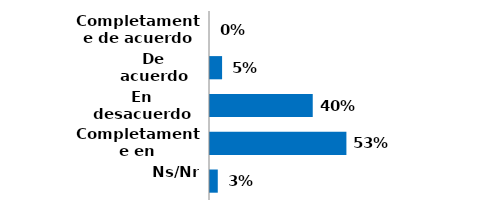
| Category | Series 0 |
|---|---|
| Completamente de acuerdo | 0 |
| De acuerdo | 0.047 |
| En desacuerdo | 0.397 |
| Completamente en desacuerdo | 0.527 |
| Ns/Nr | 0.03 |